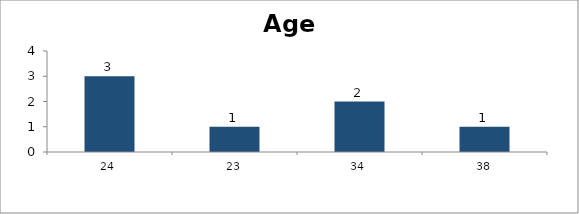
| Category | Age |
|---|---|
| 24.0 | 3 |
| 23.0 | 1 |
| 34.0 | 2 |
| 38.0 | 1 |